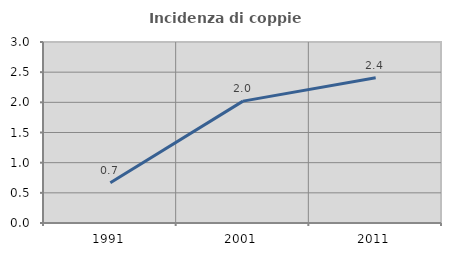
| Category | Incidenza di coppie miste |
|---|---|
| 1991.0 | 0.667 |
| 2001.0 | 2.02 |
| 2011.0 | 2.406 |